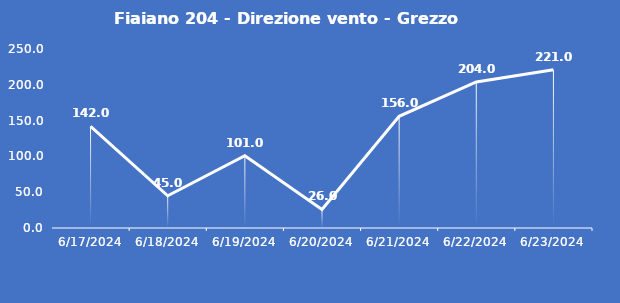
| Category | Fiaiano 204 - Direzione vento - Grezzo (°N) |
|---|---|
| 6/17/24 | 142 |
| 6/18/24 | 45 |
| 6/19/24 | 101 |
| 6/20/24 | 26 |
| 6/21/24 | 156 |
| 6/22/24 | 204 |
| 6/23/24 | 221 |